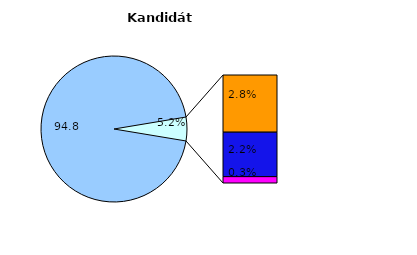
| Category | Series 0 |
|---|---|
| NK | 307 |
| ČSSD | 9 |
| ODS | 7 |
| STAN | 1 |